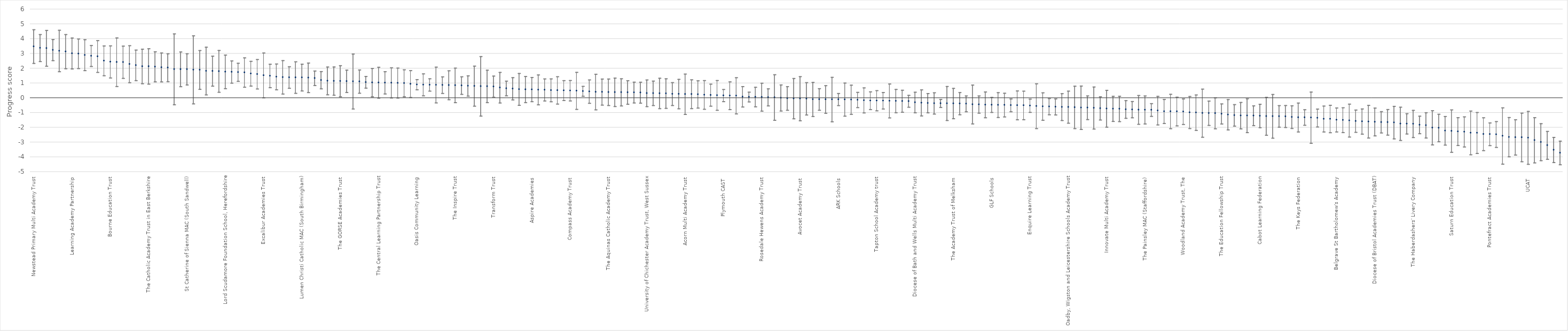
| Category | Series 0 | Series 1 | Series 2 |
|---|---|---|---|
| Newstead Primary Multi Academy Trust | 2.341 | 4.623 | 3.482 |
| Dilkes Academy Trust (Catalyst Academies Trust) | 2.467 | 4.295 | 3.381 |
| Blandford Education Trust | 2.152 | 4.575 | 3.363 |
| STEP Academy Trust | 2.528 | 3.954 | 3.241 |
| Yorkshire Collaborative Academy Trust (YCAT) | 1.779 | 4.587 | 3.183 |
| Rightforsuccess (formally Eaton Hall School) | 1.98 | 4.295 | 3.138 |
| Learning Academy Partnership | 1.967 | 4.059 | 3.013 |
| Mercia Learning Trust | 1.99 | 3.996 | 2.993 |
| North Carr Collaborative Academies Trust | 1.853 | 3.945 | 2.899 |
| Hull Collaborative Academy Trust | 2.134 | 3.55 | 2.842 |
| St Barnabas Catholic Academy Trust | 1.732 | 3.885 | 2.809 |
| South Nottingham Catholic Academy Trust | 1.509 | 3.523 | 2.516 |
| Bourne Education Trust | 1.358 | 3.529 | 2.444 |
| Aspire Educational Trust | 0.78 | 4.069 | 2.424 |
| The Boston Witham Academies Federation | 1.33 | 3.51 | 2.42 |
| St. Oswald's Catholic Academy Trust | 1.037 | 3.541 | 2.289 |
| Ormiston Trust | 1.178 | 3.246 | 2.212 |
| Our Lady of Light Catholic Academy Trust | 0.967 | 3.305 | 2.136 |
| The Catholic Academy Trust in East Berkshire | 0.937 | 3.334 | 2.136 |
| Nicholas Postgate Academy Trust | 1.092 | 3.129 | 2.11 |
| South East Essex Academy Trust | 1.09 | 3.047 | 2.068 |
| WISE Academies | 1.107 | 2.994 | 2.05 |
| KESKOWETHYANS Multi Academy Trust | -0.456 | 4.338 | 1.941 |
| Pope John 23rd MAC (Wolverhampton) | 0.765 | 3.114 | 1.94 |
| St Catherine of Sienna MAC (South Sandwell) | 0.885 | 2.994 | 1.939 |
| The Moorlands Primary Federation (TMPF) | -0.399 | 4.208 | 1.904 |
| The Holy Family of Nazareth Catholic Academy Trust | 0.588 | 3.214 | 1.901 |
| The Levels Academy Trust | 0.211 | 3.437 | 1.824 |
| Steel City Schools Partnership | 0.803 | 2.832 | 1.818 |
| Eveleigh LINK Academy Trust | 0.389 | 3.217 | 1.803 |
| Lord Scudamore Foundation School, Herefordshire | 0.633 | 2.904 | 1.769 |
| The White Horse Federation | 1.005 | 2.512 | 1.758 |
| The Spencer Academies Trust | 1.13 | 2.351 | 1.74 |
| Derby Diocesan Academy Trust | 0.731 | 2.716 | 1.723 |
| The Pioneer Academy | 0.809 | 2.483 | 1.646 |
| Frays Academy Trust | 0.611 | 2.603 | 1.607 |
| Excalibur Academies Trust | 0.013 | 3.045 | 1.529 |
| Burnt Mill Academy Trust | 0.701 | 2.285 | 1.493 |
| Diocese of Sheffield Trust | 0.557 | 2.303 | 1.43 |
| The Bishop Cleary MAC (Wolverhampton) | 0.27 | 2.53 | 1.4 |
| Aquinas Church of England Education Trust Ltd | 0.658 | 2.118 | 1.388 |
| Blackbird Academy Trust | 0.317 | 2.452 | 1.384 |
| Lumen Christi Catholic MAC (South Birmingham) | 0.476 | 2.288 | 1.382 |
| Asset Education | 0.367 | 2.367 | 1.367 |
| Harris Federation | 0.847 | 1.828 | 1.337 |
| L.E.A.D. Multi-Academy Trust | 0.619 | 1.788 | 1.204 |
| Bartholomew School | 0.216 | 2.097 | 1.157 |
| St Luke Academies Trust | 0.188 | 2.1 | 1.144 |
| The GORSE Academies Trust | 0.087 | 2.188 | 1.138 |
| Swale Academies Trust | 0.375 | 1.885 | 1.13 |
| The Warriner Multi Academy Trust | -0.741 | 2.973 | 1.116 |
| Victoria Academies Trust | 0.323 | 1.899 | 1.111 |
| Delta Academies Trust (Delta) | 0.67 | 1.455 | 1.063 |
| The Learning Pathways Trust | 0.086 | 1.998 | 1.042 |
| The Central Learning Partnership Trust | -0.011 | 2.082 | 1.036 |
| The Bishop Wheeler Catholic Academy Trust | 0.276 | 1.779 | 1.028 |
| Mowbray Education Trust | 0.001 | 2.046 | 1.024 |
| The Blessed Cyprian Tansi Catholic Academy Trust | -0.005 | 2.024 | 1.01 |
| Aurora Academies Trust | 0.087 | 1.91 | 0.998 |
| The Harmony Trust | 0.036 | 1.853 | 0.944 |
| Oasis Community Learning | 0.558 | 1.244 | 0.901 |
| Nottingham Roman Catholic Diocesan Education Service (NRCDES) | 0.147 | 1.632 | 0.89 |
| David Ross Education Trust (DRET) | 0.466 | 1.301 | 0.884 |
| Cheshire Academies Trust | -0.331 | 2.091 | 0.88 |
| Northern Education Trust | 0.311 | 1.432 | 0.872 |
| Holy Spirit MAC (Warwickshire) | -0.116 | 1.842 | 0.863 |
| The Inspire Trust | -0.314 | 2.023 | 0.854 |
| ASPIRE Academy Trust | 0.246 | 1.437 | 0.842 |
| The Good Shepherd Trust | 0.13 | 1.503 | 0.817 |
| Education South West | -0.552 | 2.16 | 0.804 |
| The Small Schools Multi Academy Trust | -1.224 | 2.805 | 0.791 |
| Carmel Education Trust | -0.309 | 1.881 | 0.786 |
| Transform Trust | 0.055 | 1.484 | 0.769 |
| Christ the King MAC (North Staffordshire) | -0.336 | 1.732 | 0.698 |
| Kent Catholic Schools Partnership (KCSP) | 0.148 | 1.142 | 0.645 |
| Diocese of Leicester Academies Trust (DLAT) | -0.127 | 1.376 | 0.625 |
| Diocese of York Educational Trust | -0.493 | 1.66 | 0.584 |
| Peninsula Learning Trust | -0.31 | 1.456 | 0.573 |
| Aspire Academies | -0.248 | 1.388 | 0.57 |
| The Co-operative Group | -0.462 | 1.56 | 0.549 |
| Aspirations Academies Trust (AAT) | -0.199 | 1.293 | 0.547 |
| Leigh Junior Infant & Nursery School | -0.254 | 1.295 | 0.52 |
| Faringdon Academy of Schools | -0.409 | 1.442 | 0.516 |
| Ventrus Limited | -0.166 | 1.177 | 0.506 |
| Compass Academy Trust | -0.196 | 1.185 | 0.495 |
| The John Paul II MAC (Sutton Coldfield) | -0.769 | 1.735 | 0.483 |
| Kemnal Academy Trust, The (TKAT) | 0.122 | 0.79 | 0.456 |
| The Newman Collegiate MAC (North Stoke) | -0.359 | 1.225 | 0.433 |
| The Rainbow Multi Academy Trust | -0.802 | 1.608 | 0.403 |
| First Federation Trust | -0.48 | 1.285 | 0.402 |
| The Aquinas Catholic Academy Trust | -0.509 | 1.287 | 0.389 |
| The Diocese of Westminster Academy Trust | -0.577 | 1.347 | 0.385 |
| The Arthur Terry Learning Partnership | -0.538 | 1.302 | 0.382 |
| Ambitions Academies Trust | -0.421 | 1.17 | 0.375 |
| Bishop Konstant Catholic Academy Trust | -0.335 | 1.074 | 0.37 |
| Lion Academy Trust | -0.346 | 1.07 | 0.362 |
| University of Chichester Academy Trust, West Sussex | -0.584 | 1.223 | 0.32 |
| Brooke Weston Trust | -0.511 | 1.146 | 0.318 |
| Outwood Grange Academies Trust | -0.722 | 1.338 | 0.308 |
| Ocean Learning Trust | -0.699 | 1.301 | 0.301 |
| Amadeus Primary Academies Trust | -0.509 | 1.043 | 0.267 |
| Connected Learning | -0.73 | 1.263 | 0.267 |
| Acorn Multi Academy Trust | -1.11 | 1.621 | 0.256 |
| St Nicholas Owen MAC (North Worcestershire/Dudley/Birmingham) | -0.72 | 1.231 | 0.255 |
| The Dominic Barberi MAC (South Oxfordshire) | -0.682 | 1.164 | 0.241 |
| The Wythenshawe Catholic Academy Trust | -0.763 | 1.181 | 0.209 |
| The Primary First Trust | -0.552 | 0.937 | 0.192 |
| The All Saints Collegiate MAC (South Stoke) | -0.83 | 1.184 | 0.177 |
| Plymouth CAST | -0.245 | 0.575 | 0.165 |
| St Cuthbert's Roman Catholic Academy Trust | -0.783 | 1.091 | 0.154 |
| St Piran's Cross Church of England Multi Academy Trust | -1.076 | 1.373 | 0.149 |
| CfBT Education Trust | -0.609 | 0.772 | 0.081 |
| Academies Enterprise Trust (AET) | -0.264 | 0.396 | 0.066 |
| The Flying High Trust | -0.594 | 0.725 | 0.066 |
| Rosedale Hewens Academy Trust | -0.886 | 1.001 | 0.057 |
| Education Central Multi Academy Trust | -0.536 | 0.62 | 0.042 |
| Brighter Futures Academy Trust | -1.507 | 1.577 | 0.035 |
| Cidari Trust | -0.88 | 0.886 | 0.003 |
| Diocese of London | -0.83 | 0.768 | -0.031 |
| Valley Invicta Academies Trust | -1.408 | 1.322 | -0.043 |
| Avocet Academy Trust | -1.538 | 1.445 | -0.046 |
| Samuel Ward Academy Trust | -1.15 | 1.041 | -0.054 |
| South Dartmoor Academy | -1.249 | 1.055 | -0.097 |
| The Archbishop Romero MAC (Coventry) | -0.829 | 0.633 | -0.098 |
| Paradigm Trust | -1.033 | 0.835 | -0.099 |
| The Shropshire Gateway Educational Trust | -1.607 | 1.4 | -0.103 |
| ARK Schools | -0.514 | 0.307 | -0.104 |
| Adventure Learning Academy Trust | -1.228 | 1.011 | -0.109 |
| Robus Multi Academy Trust | -1.103 | 0.868 | -0.117 |
| Active Learning Trust (ALT) | -0.651 | 0.383 | -0.134 |
| Corpus Christi Catholic Academy Trust | -1.011 | 0.685 | -0.163 |
| Focus Academy Trust (UK) Ltd | -0.781 | 0.418 | -0.182 |
| Tapton School Academy trust | -0.868 | 0.5 | -0.184 |
| E-ACT | -0.742 | 0.369 | -0.186 |
| St Simon and Jude Church of England Academy Trust | -1.346 | 0.946 | -0.2 |
| The Hamwic Trust | -0.994 | 0.579 | -0.208 |
| Diocese of Peterborough | -0.961 | 0.528 | -0.217 |
| Greenwood Academies Trust | -0.624 | 0.179 | -0.222 |
| Diocese of Bath and Wells Multi Academy Trust | -0.998 | 0.393 | -0.303 |
| Spiral Partnership Trust | -1.211 | 0.549 | -0.331 |
| Schoolsworks Academy Trust | -1.001 | 0.302 | -0.35 |
| Tudhoe Learning Trust | -1.088 | 0.355 | -0.366 |
| REAch2 Academy Trust | -0.638 | -0.095 | -0.367 |
| Pioneer Academies Co-operative Trust | -1.522 | 0.781 | -0.371 |
| The Academy Trust of Melksham | -1.402 | 0.651 | -0.376 |
| The Collaborative Academies Trust | -1.132 | 0.368 | -0.382 |
| The Park Federation Academy Trust | -0.926 | 0.141 | -0.393 |
| The Duchy Academy Trust | -1.752 | 0.874 | -0.439 |
| Discovery Schools Academies Trust Ltd | -1.026 | 0.14 | -0.443 |
| St Mary’s Academy Trust | -1.337 | 0.408 | -0.464 |
| GLF Schools | -0.978 | 0.04 | -0.469 |
| Diocese of Gloucester Academies Trust | -1.316 | 0.361 | -0.478 |
| Academy Transformation Trust (ATT) | -1.279 | 0.323 | -0.478 |
| The Elliot Foundation Academies Trust | -0.924 | -0.063 | -0.493 |
| Pax Christi Catholic Academy Trust | -1.473 | 0.477 | -0.498 |
| Spring Partnership Trust | -1.466 | 0.464 | -0.501 |
| Enquire Learning Trust | -0.972 | -0.075 | -0.524 |
| West Stafford Multi-Academy Trust | -2.07 | 0.962 | -0.554 |
| St Chad's Academies Trust | -1.504 | 0.353 | -0.576 |
| The Griffin Schools Trust | -1.133 | -0.038 | -0.585 |
| University of Brighton (Hastings Academies Trust) | -1.145 | -0.058 | -0.602 |
| Gloucestershire Learning Alliance | -1.524 | 0.293 | -0.615 |
| Oadby, Wigston and Leicestershire Schools Academy Trust | -1.705 | 0.466 | -0.62 |
| West Norfolk Academies Trust | -2.071 | 0.799 | -0.636 |
| Heartwood Church of England Academy Trust | -2.126 | 0.81 | -0.658 |
| Atlantic Centre of Excellence (ACE) | -1.46 | 0.142 | -0.659 |
| The Rutland Learning Trust | -2.102 | 0.747 | -0.678 |
| Leigh Academies Trust | -1.489 | 0.084 | -0.702 |
| Innovate Multi Academy Trust | -1.971 | 0.519 | -0.726 |
| EMLC Academy Trust | -1.585 | 0.115 | -0.735 |
| Portswood Primary Academy Trust | -1.598 | 0.119 | -0.74 |
| Diocese of Canterbury | -1.375 | -0.178 | -0.777 |
| Diocese of Coventry | -1.34 | -0.236 | -0.788 |
| The Village Academy Trust | -1.779 | 0.171 | -0.804 |
| The Painsley MAC (Staffordshire) | -1.753 | 0.14 | -0.807 |
| United Learning | -1.242 | -0.379 | -0.81 |
| Waterton Academy Trust | -1.82 | 0.11 | -0.855 |
| NET Academies Trust (NETAT) | -1.722 | -0.101 | -0.911 |
| The Williamson Trust | -2.075 | 0.251 | -0.912 |
| White Woods Primary Academy Trust | -1.886 | 0.058 | -0.914 |
| Woodland Academy Trust, The | -1.789 | -0.062 | -0.926 |
| The Diamond Learning Partnership Trust | -2.068 | 0.103 | -0.982 |
| Bradford Diocesan Academies Trust | -2.189 | 0.208 | -0.991 |
| South Northamptonshire Church of England Multi Academy Trust | -2.654 | 0.604 | -1.025 |
| Evolution Academy Trust | -1.853 | -0.208 | -1.03 |
| Inspire Education Trust | -2.083 | 0.01 | -1.037 |
| The Education Fellowship Trust | -1.756 | -0.4 | -1.078 |
| St Gilbert of Sempringham Catholic Academy Trust | -2.16 | -0.107 | -1.133 |
| Diocese of Exeter | -1.9 | -0.446 | -1.173 |
| Creative Education Trust | -2.09 | -0.299 | -1.195 |
| South Essex Academy Trust | -2.342 | -0.05 | -1.196 |
| Diocese of Chelmsford | -1.868 | -0.532 | -1.2 |
| Cabot Learning Federation | -2.008 | -0.424 | -1.216 |
| The Redstart Learning Partnership | -2.518 | 0.045 | -1.237 |
| Diocese of Lincoln | -2.718 | 0.241 | -1.239 |
| The Thinking Schools Academy Trust | -1.972 | -0.515 | -1.244 |
| Osborne Co-operative Academy Trust | -1.997 | -0.509 | -1.253 |
| Diocese of Birmingham Education Trust | -2.062 | -0.527 | -1.295 |
| The Keys Federation | -2.296 | -0.339 | -1.318 |
| Diocese of Ely | -1.845 | -0.793 | -1.319 |
| Diocese of Hereford | -3.062 | 0.401 | -1.331 |
| Diocese of Norwich Education Academies Trust | -1.959 | -0.748 | -1.354 |
| Bright Futures Educational Trust | -2.296 | -0.545 | -1.421 |
| Vale Academy Trust | -2.349 | -0.492 | -1.421 |
| Belgrave St Bartholomew's Academy | -2.295 | -0.674 | -1.485 |
| Askel Veur - Diocese of Truro | -2.337 | -0.659 | -1.498 |
| Tees Valley Education | -2.642 | -0.413 | -1.527 |
| Montsaye Community Learning Partnership | -2.323 | -0.813 | -1.568 |
| Blackpool Multi Academy Trust | -2.443 | -0.739 | -1.591 |
| Aston Community Education Trust (ACET) | -2.709 | -0.499 | -1.604 |
| Diocese of Bristol Academies Trust (DBAT) | -2.563 | -0.682 | -1.623 |
| Wakefield City Academies Trust | -2.363 | -0.92 | -1.642 |
| Diocese of Salisbury | -2.51 | -0.779 | -1.644 |
| Portsmouth & Winchester Diocesan Academies Trust | -2.765 | -0.565 | -1.665 |
| The Stour Academy Trust | -2.87 | -0.621 | -1.745 |
| Northampton Primary Academy Trust Partnership | -2.435 | -1.06 | -1.748 |
| The Haberdashers' Livery Company | -2.676 | -0.836 | -1.756 |
| Diocese of Oxford | -2.416 | -1.23 | -1.823 |
| Community Academies Trust (CAT) | -2.708 | -0.995 | -1.852 |
| Diocese of Hallam | -3.173 | -0.859 | -2.016 |
| Enhance Academy Trust | -2.96 | -1.098 | -2.029 |
| Inspiration Trust | -3.187 | -1.25 | -2.219 |
| Saturn Education Trust | -3.673 | -0.803 | -2.238 |
| Maltby Learning Trust | -3.212 | -1.332 | -2.272 |
| Willows Academy Trust | -3.312 | -1.275 | -2.294 |
| Truro and Penwith College | -3.841 | -0.882 | -2.362 |
| TEAM Multi-Academy Trust | -3.749 | -0.981 | -2.365 |
| The Mead Academy Trust | -3.559 | -1.339 | -2.449 |
| Pontefract Academies Trust | -3.221 | -1.685 | -2.453 |
| Bright Tribe Trust | -3.342 | -1.596 | -2.469 |
| HEARTS Academy Trust | -4.474 | -0.664 | -2.569 |
| Merchant Venturers, The Society of | -3.979 | -1.32 | -2.649 |
| Laidlaw Schools Trust | -3.858 | -1.473 | -2.666 |
| Chulmleigh Academy Trust | -4.312 | -1.023 | -2.668 |
| UCAT | -4.488 | -0.906 | -2.697 |
| Trenance Learning Academy Trust (TLAT) | -4.39 | -1.332 | -2.861 |
| Prime7 | -4.241 | -1.737 | -2.989 |
| The Blyth Quays Trust | -4.146 | -2.259 | -3.202 |
| Ninestiles Academy Trust | -4.367 | -2.667 | -3.517 |
| Gateway Academy Trust | -4.517 | -2.916 | -3.717 |